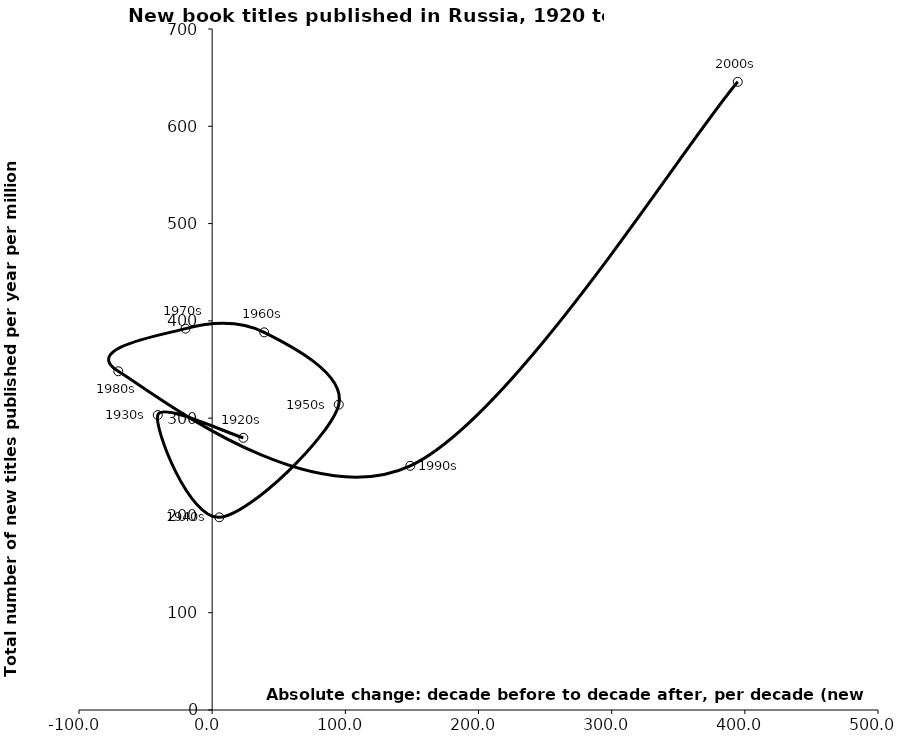
| Category | Series 0 |
|---|---|
| 23.413017089634764 | 279.768 |
| -40.84943035503184 | 303.181 |
| 5.3821552402980615 | 198.069 |
| 95.06843853288555 | 313.945 |
| 39.0262617506491 | 388.206 |
| -20.016670746141045 | 391.998 |
| -70.49755680873946 | 348.173 |
| 148.764856532415 | 251.003 |
| 394.69965047420516 | 645.702 |